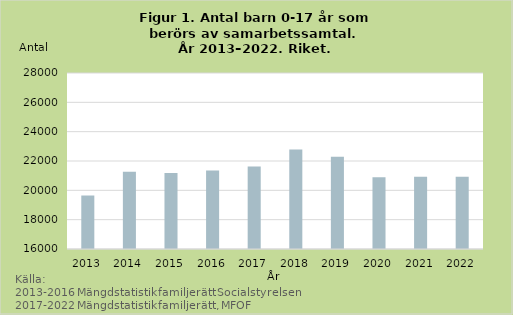
| Category | Samarbetssamtal |
|---|---|
| 2013.0 | 19647 |
| 2014.0 | 21265 |
| 2015.0 | 21188 |
| 2016.0 | 21356 |
| 2017.0 | 21622 |
| 2018.0 | 22783 |
| 2019.0 | 22290 |
| 2020.0 | 20886 |
| 2021.0 | 20931 |
| 2022.0 | 20922 |